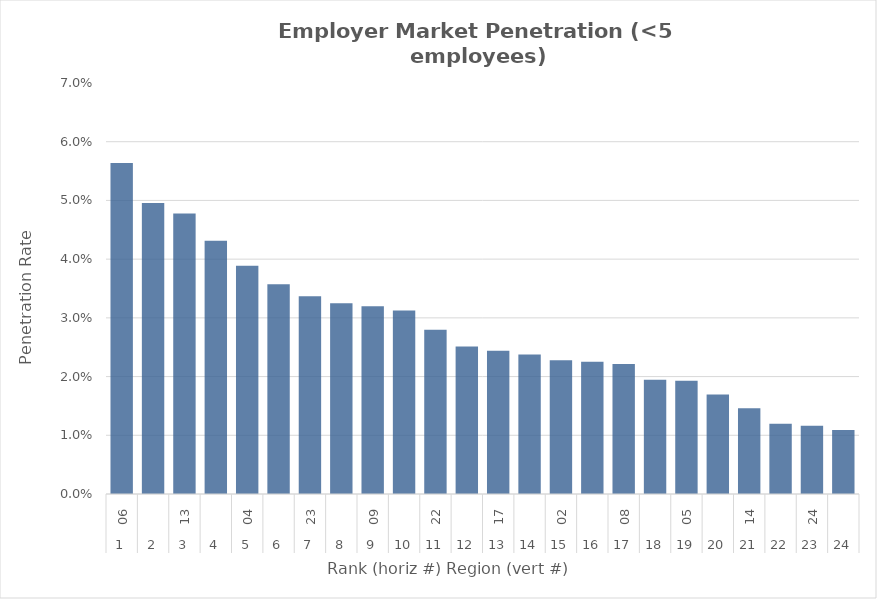
| Category | Rate |
|---|---|
| 0 | 0.056 |
| 1 | 0.05 |
| 2 | 0.048 |
| 3 | 0.043 |
| 4 | 0.039 |
| 5 | 0.036 |
| 6 | 0.034 |
| 7 | 0.032 |
| 8 | 0.032 |
| 9 | 0.031 |
| 10 | 0.028 |
| 11 | 0.025 |
| 12 | 0.024 |
| 13 | 0.024 |
| 14 | 0.023 |
| 15 | 0.023 |
| 16 | 0.022 |
| 17 | 0.019 |
| 18 | 0.019 |
| 19 | 0.017 |
| 20 | 0.015 |
| 21 | 0.012 |
| 22 | 0.012 |
| 23 | 0.011 |